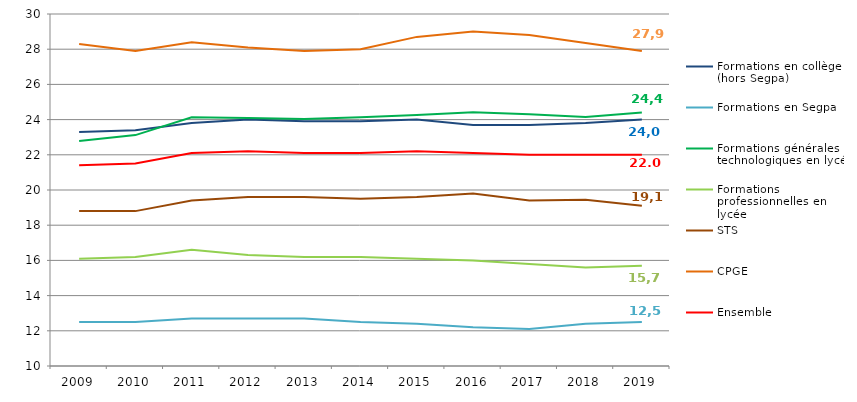
| Category | Formations en collège (hors Segpa) | Formations en Segpa | Formations générales et technologiques en lycée | Formations professionnelles en lycée | STS | CPGE | Ensemble |
|---|---|---|---|---|---|---|---|
| 2009.0 | 23.3 | 12.5 | 22.78 | 16.1 | 18.8 | 28.3 | 21.4 |
| 2010.0 | 23.4 | 12.5 | 23.12 | 16.2 | 18.8 | 27.9 | 21.5 |
| 2011.0 | 23.8 | 12.7 | 24.13 | 16.6 | 19.4 | 28.4 | 22.1 |
| 2012.0 | 24 | 12.7 | 24.09 | 16.3 | 19.6 | 28.1 | 22.2 |
| 2013.0 | 23.9 | 12.7 | 24.04 | 16.2 | 19.6 | 27.9 | 22.1 |
| 2014.0 | 23.9 | 12.5 | 24.13 | 16.2 | 19.5 | 28 | 22.1 |
| 2015.0 | 24 | 12.4 | 24.26 | 16.1 | 19.6 | 28.7 | 22.2 |
| 2016.0 | 23.7 | 12.2 | 24.42 | 16 | 19.8 | 29 | 22.1 |
| 2017.0 | 23.7 | 12.1 | 24.31 | 15.8 | 19.4 | 28.8 | 22 |
| 2018.0 | 23.8 | 12.4 | 24.15 | 15.6 | 19.45 | 28.35 | 22 |
| 2019.0 | 24 | 12.5 | 24.4 | 15.7 | 19.1 | 27.9 | 22 |